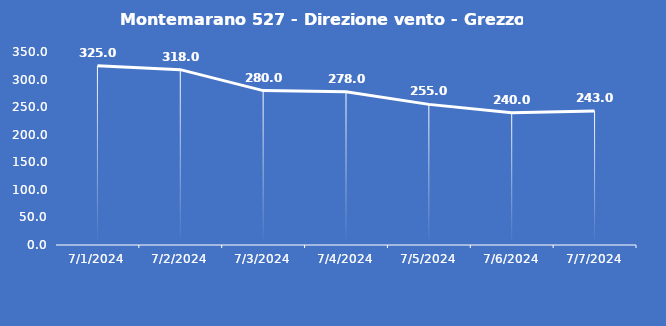
| Category | Montemarano 527 - Direzione vento - Grezzo (°N) |
|---|---|
| 7/1/24 | 325 |
| 7/2/24 | 318 |
| 7/3/24 | 280 |
| 7/4/24 | 278 |
| 7/5/24 | 255 |
| 7/6/24 | 240 |
| 7/7/24 | 243 |